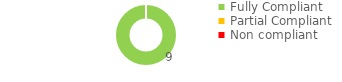
| Category | Series 0 |
|---|---|
| Fully Compliant | 9 |
| Partial Compliant | 0 |
| Non compliant | 0 |